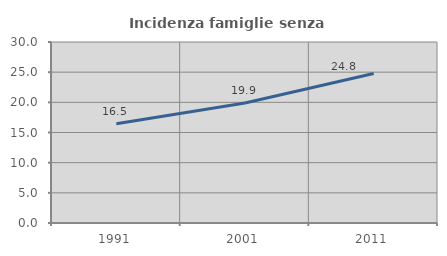
| Category | Incidenza famiglie senza nuclei |
|---|---|
| 1991.0 | 16.457 |
| 2001.0 | 19.893 |
| 2011.0 | 24.784 |